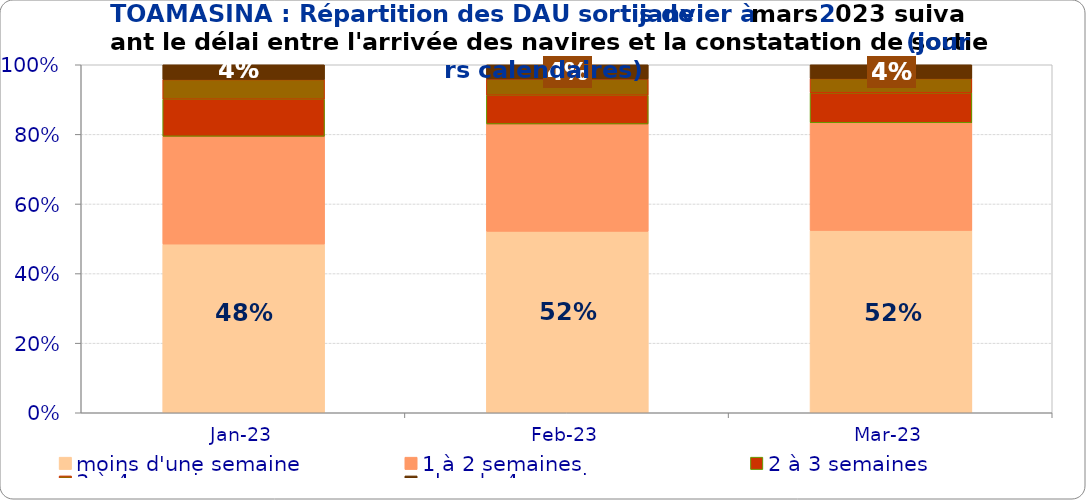
| Category | moins d'une semaine | 1 à 2 semaines | 2 à 3 semaines | 3 à 4 semaines | plus de 4 semaines |
|---|---|---|---|---|---|
| 2023-01-01 | 0.485 | 0.31 | 0.107 | 0.057 | 0.042 |
| 2023-02-01 | 0.521 | 0.309 | 0.083 | 0.047 | 0.041 |
| 2023-03-01 | 0.524 | 0.309 | 0.086 | 0.041 | 0.039 |